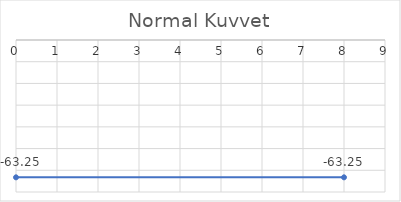
| Category | Series 0 |
|---|---|
| 0.0 | -63.246 |
| 8.0 | -63.246 |